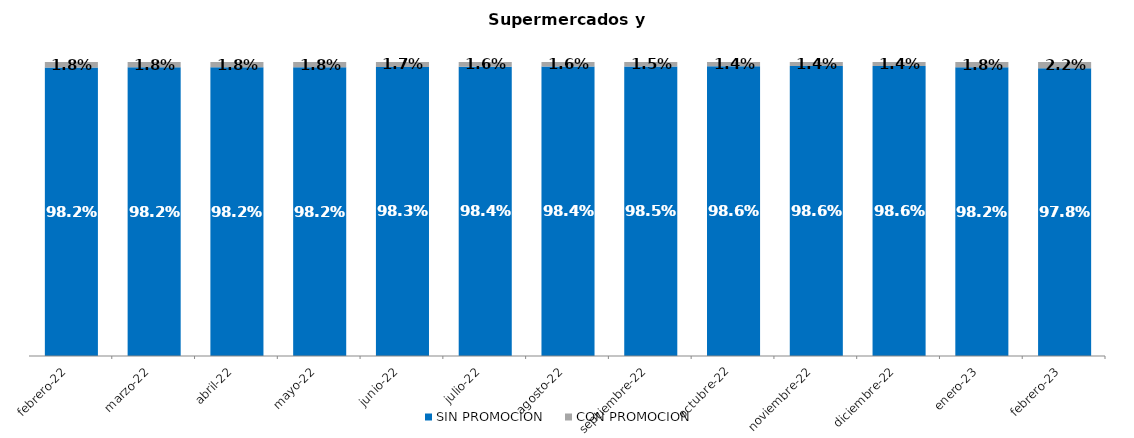
| Category | SIN PROMOCION   | CON PROMOCION   |
|---|---|---|
| 2022-02-01 | 0.982 | 0.018 |
| 2022-03-01 | 0.982 | 0.018 |
| 2022-04-01 | 0.982 | 0.018 |
| 2022-05-01 | 0.982 | 0.018 |
| 2022-06-01 | 0.983 | 0.017 |
| 2022-07-01 | 0.984 | 0.016 |
| 2022-08-01 | 0.984 | 0.016 |
| 2022-09-01 | 0.985 | 0.015 |
| 2022-10-01 | 0.986 | 0.014 |
| 2022-11-01 | 0.986 | 0.014 |
| 2022-12-01 | 0.986 | 0.014 |
| 2023-01-01 | 0.982 | 0.018 |
| 2023-02-01 | 0.978 | 0.022 |